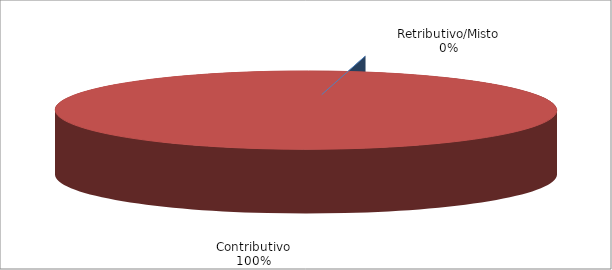
| Category | Series 1 |
|---|---|
| Retributivo/Misto | 0 |
| Contributivo | 29838 |